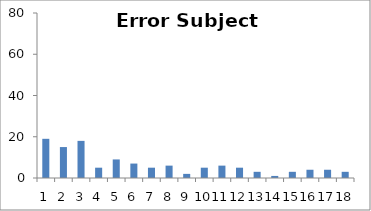
| Category | Sub16 |
|---|---|
| 0 | 19 |
| 1 | 15 |
| 2 | 18 |
| 3 | 5 |
| 4 | 9 |
| 5 | 7 |
| 6 | 5 |
| 7 | 6 |
| 8 | 2 |
| 9 | 5 |
| 10 | 6 |
| 11 | 5 |
| 12 | 3 |
| 13 | 1 |
| 14 | 3 |
| 15 | 4 |
| 16 | 4 |
| 17 | 3 |